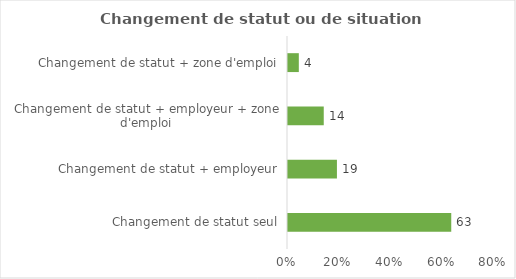
| Category | Series 0 |
|---|---|
| Changement de statut seul | 63.093 |
| Changement de statut + employeur | 18.91 |
| Changement de statut + employeur + zone d'emploi | 13.817 |
| Changement de statut + zone d'emploi | 4.18 |